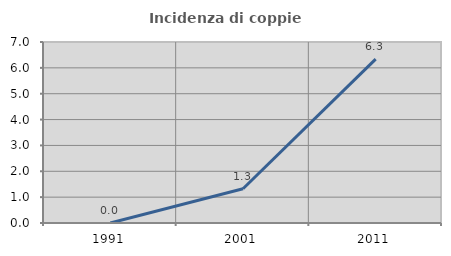
| Category | Incidenza di coppie miste |
|---|---|
| 1991.0 | 0 |
| 2001.0 | 1.325 |
| 2011.0 | 6.338 |